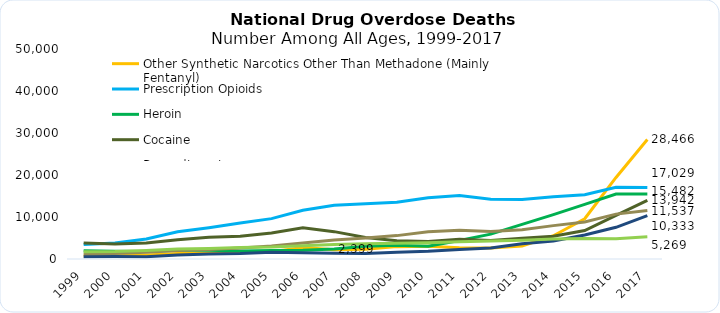
| Category | Other Synthetic Narcotics Other Than Methadone (Mainly Fentanyl) | Prescription Opioids | Heroin | Cocaine | Benzodiazepines | Psychostimulants with Abuse Potential (Including Methamphetamine) | Antidepressants |
|---|---|---|---|---|---|---|---|
| 1999.0 | 730 | 3442 | 1960 | 3822 | 1135 | 547 | 1749 |
| 2000.0 | 782 | 3785 | 1842 | 3544 | 1298 | 578 | 1798 |
| 2001.0 | 957 | 4770 | 1779 | 3833 | 1594 | 563 | 2017 |
| 2002.0 | 1295 | 6483 | 2089 | 4599 | 2022 | 941 | 2370 |
| 2003.0 | 1400 | 7461 | 2080 | 5199 | 2248 | 1179 | 2512 |
| 2004.0 | 1664 | 8577 | 1878 | 5443 | 2627 | 1305 | 2758 |
| 2005.0 | 1742 | 9612 | 2009 | 6208 | 3084 | 1608 | 2861 |
| 2006.0 | 2707 | 11589 | 2088 | 7448 | 3835 | 1462 | 3133 |
| 2007.0 | 2213 | 12796 | 2399 | 6512 | 4500 | 1378 | 3425 |
| 2008.0 | 2306 | 13149 | 3041 | 5129 | 5010 | 1302 | 3610 |
| 2009.0 | 2946 | 13523 | 3278 | 4350 | 5567 | 1632 | 3768 |
| 2010.0 | 3007 | 14583 | 3036 | 4183 | 6497 | 1854 | 3889 |
| 2011.0 | 2666 | 15140 | 4397 | 4681 | 6872 | 2266 | 4113 |
| 2012.0 | 2628 | 14240 | 5925 | 4404 | 6524 | 2635 | 4259 |
| 2013.0 | 3105 | 14145 | 8257 | 4944 | 6973 | 3627 | 4458 |
| 2014.0 | 5544 | 14838 | 10574 | 5415 | 7945 | 4298 | 4768 |
| 2015.0 | 9580 | 15281 | 12989 | 6784 | 8791 | 5716 | 4894 |
| 2016.0 | 19413 | 17087 | 15469 | 10375 | 10684 | 7542 | 4812 |
| 2017.0 | 28466 | 17029 | 15482 | 13942 | 11537 | 10333 | 5269 |